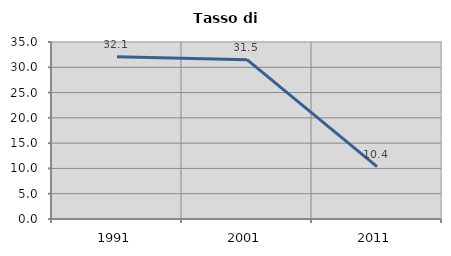
| Category | Tasso di disoccupazione   |
|---|---|
| 1991.0 | 32.107 |
| 2001.0 | 31.502 |
| 2011.0 | 10.373 |